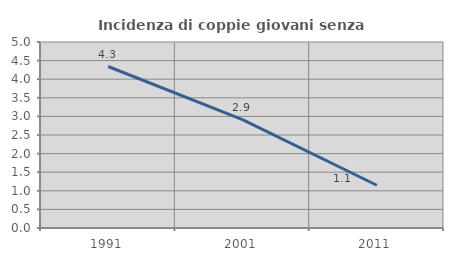
| Category | Incidenza di coppie giovani senza figli |
|---|---|
| 1991.0 | 4.341 |
| 2001.0 | 2.911 |
| 2011.0 | 1.149 |